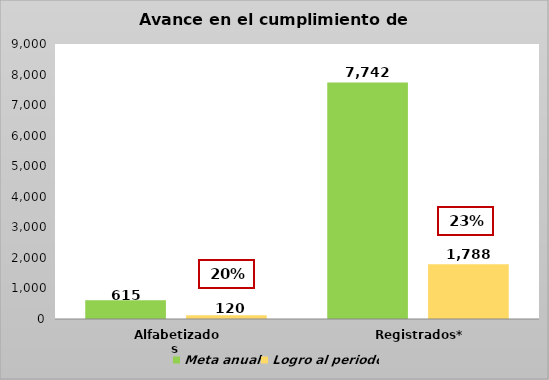
| Category | Meta anual | Logro al periodo |
|---|---|---|
| Alfabetizados  | 615 | 120 |
| Registrados* | 7742 | 1788 |